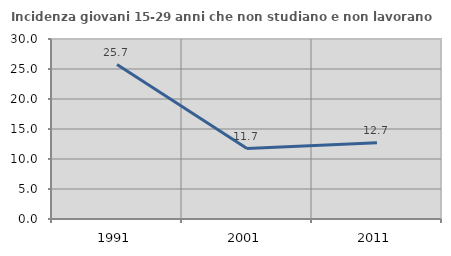
| Category | Incidenza giovani 15-29 anni che non studiano e non lavorano  |
|---|---|
| 1991.0 | 25.733 |
| 2001.0 | 11.737 |
| 2011.0 | 12.727 |